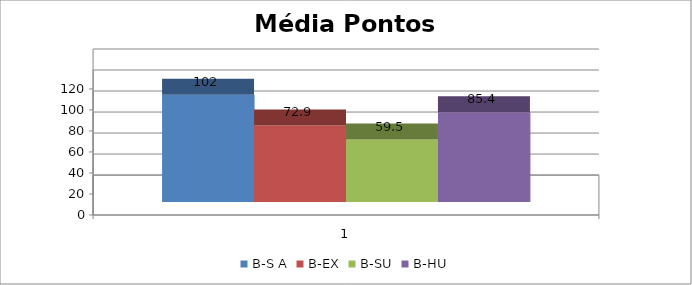
| Category | B-S A | B-EX | B-SU | B-HU |
|---|---|---|---|---|
| 0 | 102.016 | 72.899 | 59.455 | 85.429 |